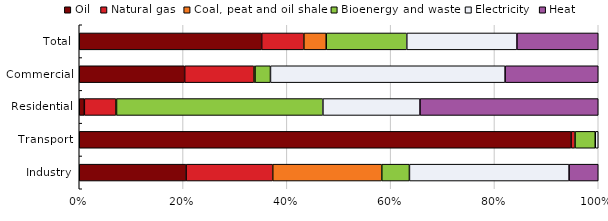
| Category | Oil | Natural gas | Coal, peat and oil shale | Bioenergy and waste | Electricity | Heat |
|---|---|---|---|---|---|---|
| Industry | 122.665 | 99.483 | 125.169 | 31.768 | 183.314 | 33.462 |
| Transport | 791.883 | 6.406 | 0 | 32.561 | 4.815 | 0 |
| Residential | 9.363 | 57.758 | 1.191 | 378.38 | 177.988 | 326.741 |
| Commercial | 118.014 | 77.476 | 1.257 | 17.312 | 262.683 | 104.256 |
| Total | 1041.925 | 241.122 | 127.617 | 460.303 | 629.144 | 464.46 |